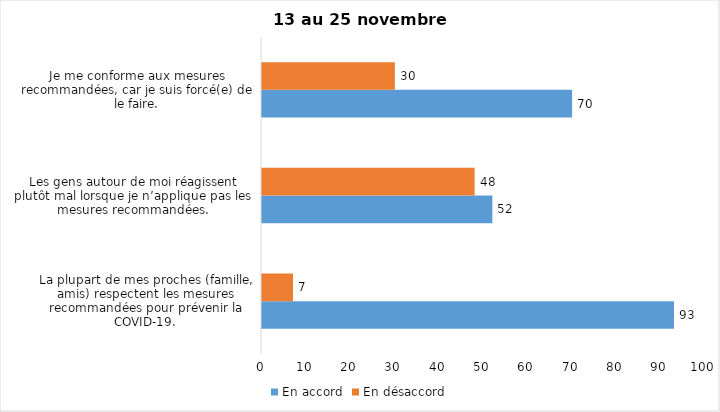
| Category | En accord | En désaccord |
|---|---|---|
| La plupart de mes proches (famille, amis) respectent les mesures recommandées pour prévenir la COVID-19. | 93 | 7 |
| Les gens autour de moi réagissent plutôt mal lorsque je n’applique pas les mesures recommandées. | 52 | 48 |
| Je me conforme aux mesures recommandées, car je suis forcé(e) de le faire. | 70 | 30 |